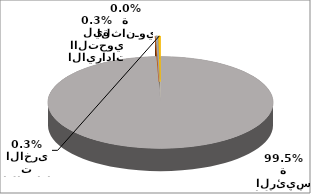
| Category | Series 0 |
|---|---|
| الايرادات الرئيسة | 120410319 |
| الايـرادات الثانـوية | 2479 |
| الايرادات االتحويلية | 354442 |
| الايرادات الاخرى | 307542 |